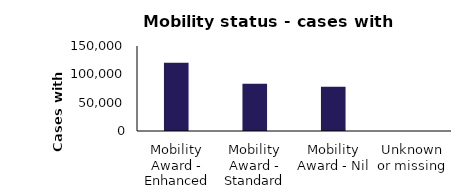
| Category | Series 0 |
|---|---|
| Mobility Award - Enhanced | 120395 |
| Mobility Award - Standard | 83368 |
| Mobility Award - Nil | 78010 |
| Unknown or missing | 17 |